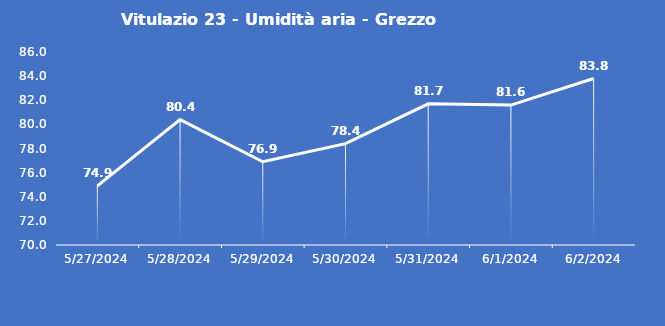
| Category | Vitulazio 23 - Umidità aria - Grezzo (%) |
|---|---|
| 5/27/24 | 74.9 |
| 5/28/24 | 80.4 |
| 5/29/24 | 76.9 |
| 5/30/24 | 78.4 |
| 5/31/24 | 81.7 |
| 6/1/24 | 81.6 |
| 6/2/24 | 83.8 |